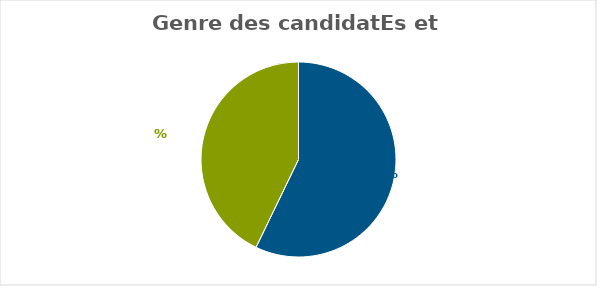
| Category | Series 0 |
|---|---|
| % hommes | 0.572 |
| % femmes | 0.428 |